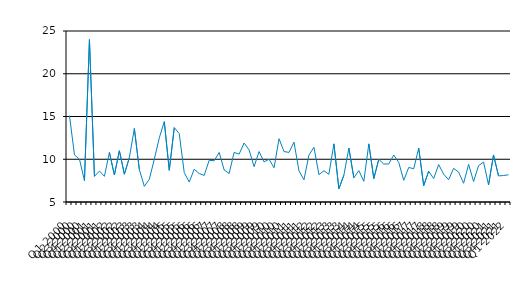
| Category | Series 0 |
|---|---|
| Q1 2000 | 15.1 |
| Q2 2000 | 10.5 |
| Q3 2000 | 10 |
| Q4 2000 | 7.5 |
| Q1 2001 | 24 |
| Q2 2001 | 8 |
| Q3 2001 | 8.62 |
| Q4 2001 | 8 |
| Q1 2002 | 10.8 |
| Q2 2002 | 8.16 |
| Q3 2002 | 11 |
| Q4 2002 | 8.25 |
| Q1 2003 | 10.2 |
| Q2 2003 | 13.6 |
| Q3 2003 | 8.8 |
| Q4 2003 | 6.83 |
| Q1 2004 | 7.66 |
| Q2 2004 | 10 |
| Q3 2004 | 12.5 |
| Q4 2004 | 14.4 |
| Q1 2005 | 8.71 |
| Q2 2005 | 13.7 |
| Q3 2005 | 13 |
| Q4 2005 | 8.44 |
| Q1 2006 | 7.33 |
| Q2 2006 | 8.83 |
| Q3 2006 | 8.33 |
| Q4 2006 | 8.11 |
| Q1 2007 | 9.88 |
| Q2 2007 | 9.82 |
| Q3 2007 | 10.8 |
| Q4 2007 | 8.75 |
| Q1 2008 | 8.33 |
| Q2 2008 | 10.8 |
| Q3 2008 | 10.6 |
| Q4 2008 | 11.9 |
| Q1 2009 | 11.1 |
| Q2 2009 | 9.13 |
| Q3 2009 | 10.9 |
| Q4 2009 | 9.69 |
| Q1 2010 | 10 |
| Q2 2010 | 9 |
| Q3 2010 | 12.4 |
| Q4 2010 | 10.9 |
| Q1 2011 | 10.8 |
| Q2 2011 | 12 |
| Q3 2011 | 8.64 |
| Q4 2011 | 7.6 |
| Q1 2012 | 10.5 |
| Q2 2012 | 11.4 |
| Q3 2012 | 8.2 |
| Q4 2012 | 8.65 |
| Q1 2013 | 8.24 |
| Q2 2013 | 11.8 |
| Q3 2013 | 6.55 |
| Q4 2013 | 8.14 |
| Q1 2014 | 11.3 |
| Q2 2014 | 7.83 |
| Q3 2014 | 8.67 |
| Q4 2014 | 7.42 |
| Q1 2015 | 11.8 |
| Q2 2015 | 7.74 |
| Q3 2015 | 10 |
| Q4 2015 | 9.44 |
| Q1 2016 | 9.45 |
| Q2 2016 | 10.5 |
| Q3 2016 | 9.62 |
| Q4 2016 | 7.54 |
| Q1 2017 | 9.04 |
| Q2 2017 | 8.89 |
| Q3 2017 | 11.3 |
| Q4 2017 | 6.91 |
| Q1 2018 | 8.6 |
| Q2 2018 | 7.74 |
| Q3 2018 | 9.38 |
| Q4 2018 | 8.26 |
| Q1 2019 | 7.6 |
| Q2 2019 | 8.941 |
| Q3 2019 | 8.5 |
| Q4 2019 | 7.19 |
| Q1 2020 | 9.41 |
| Q2 2020 | 7.4 |
| Q3 2020 | 9.25 |
| Q4 2020 | 9.67 |
| Q1 2021 | 7 |
| Q2 2021 | 10.5 |
| Q3 2021 | 8.05 |
| Q4 2021 | 8.1 |
| Q1 2022 | 8.18 |